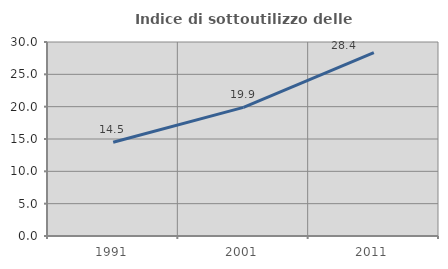
| Category | Indice di sottoutilizzo delle abitazioni  |
|---|---|
| 1991.0 | 14.489 |
| 2001.0 | 19.888 |
| 2011.0 | 28.356 |